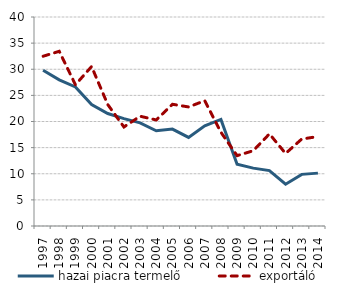
| Category | hazai piacra termelő | exportáló |
|---|---|---|
| 1997.0 | 29.809 | 32.488 |
| 1998.0 | 27.974 | 33.439 |
| 1999.0 | 26.606 | 27.036 |
| 2000.0 | 23.254 | 30.52 |
| 2001.0 | 21.522 | 23.245 |
| 2002.0 | 20.544 | 18.951 |
| 2003.0 | 19.752 | 21.009 |
| 2004.0 | 18.232 | 20.295 |
| 2005.0 | 18.542 | 23.297 |
| 2006.0 | 16.961 | 22.787 |
| 2007.0 | 19.158 | 23.98 |
| 2008.0 | 20.407 | 17.942 |
| 2009.0 | 11.835 | 13.463 |
| 2010.0 | 11.076 | 14.404 |
| 2011.0 | 10.597 | 17.632 |
| 2012.0 | 7.993 | 13.882 |
| 2013.0 | 9.885 | 16.647 |
| 2014.0 | 10.119 | 17.116 |